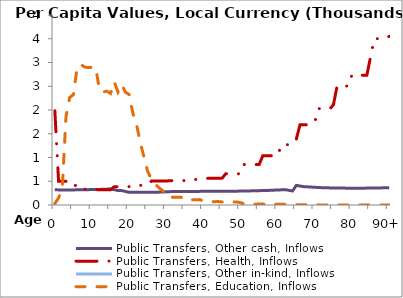
| Category | Public Transfers, Other cash, Inflows | Public Transfers, Health, Inflows | Public Transfers, Other in-kind, Inflows | Public Transfers, Education, Inflows |
|---|---|---|---|---|
| 0 | 319.309 | 1983.373 |  | 32.135 |
|  | 318.33 | 498.661 |  | 150.104 |
| 2 | 317.352 | 498.634 |  | 361.746 |
| 3 | 316.642 | 498.577 |  | 1859.614 |
| 4 | 316.993 | 498.581 |  | 2264.527 |
| 5 | 317.869 | 498.595 |  | 2323.455 |
| 6 | 319.094 | 333.888 |  | 2901.037 |
| 7 | 320.497 | 333.89 |  | 2957.593 |
| 8 | 321.9 | 333.895 |  | 2905.583 |
| 9 | 323.303 | 333.887 |  | 2892.647 |
| 10 | 324.706 | 333.883 |  | 2900.059 |
| 11 | 326.285 | 321.68 |  | 2891.752 |
| 12 | 328.214 | 321.669 |  | 2430.068 |
| 13 | 330.846 | 321.664 |  | 2377.22 |
| 14 | 333.826 | 321.657 |  | 2397.726 |
| 15 | 337.509 | 321.644 |  | 2347.552 |
| 16 | 321.728 | 386.093 |  | 2590.651 |
| 17 | 305.429 | 386.094 |  | 2378.329 |
| 18 | 303.396 | 386.094 |  | 2534.379 |
| 19 | 285.609 | 386.104 |  | 2375.406 |
| 20 | 266.884 | 386.108 |  | 2326.464 |
| 21 | 267.032 | 414.923 |  | 1929.193 |
| 22 | 267.352 | 414.96 |  | 1692.531 |
| 23 | 267.528 | 414.996 |  | 1311.458 |
| 24 | 267.705 | 415.042 |  | 1009.749 |
| 25 | 267.881 | 415.077 |  | 702.067 |
| 26 | 267.878 | 503.65 |  | 548.62 |
| 27 | 267.701 | 503.754 |  | 442.269 |
| 28 | 271.072 | 503.879 |  | 365.385 |
| 29 | 274.441 | 503.997 |  | 307.248 |
| 30 | 277.804 | 504.258 |  | 175.202 |
| 31 | 281.346 | 512.308 |  | 162.606 |
| 32 | 284.898 | 512.589 |  | 163.03 |
| 33 | 284.898 | 512.892 |  | 162.85 |
| 34 | 284.898 | 513.11 |  | 162.935 |
| 35 | 284.898 | 513.341 |  | 106.596 |
| 36 | 284.898 | 537.915 |  | 108.134 |
| 37 | 284.898 | 538.043 |  | 109.612 |
| 38 | 285.834 | 538.15 |  | 111.467 |
| 39 | 286.77 | 538.286 |  | 113.511 |
| 40 | 287.534 | 538.397 |  | 87.446 |
| 41 | 288.297 | 561.878 |  | 69.039 |
| 42 | 289.051 | 561.895 |  | 69.652 |
| 43 | 288.876 | 561.925 |  | 70.686 |
| 44 | 288.701 | 561.946 |  | 71.688 |
| 45 | 288.701 | 561.94 |  | 64.921 |
| 46 | 288.701 | 656.689 |  | 65.219 |
| 47 | 288.701 | 656.688 |  | 65.392 |
| 48 | 290.142 | 656.701 |  | 64.943 |
| 49 | 291.57 | 656.74 |  | 63.622 |
| 50 | 293.004 | 656.789 |  | 49.489 |
| 51 | 294.439 | 852.338 |  | 18.427 |
| 52 | 295.877 | 852.301 |  | 17.02 |
| 53 | 297.864 | 852.268 |  | 15.632 |
| 54 | 299.882 | 852.243 |  | 14.463 |
| 55 | 301.904 | 852.219 |  | 20.965 |
| 56 | 303.917 | 1039.327 |  | 20.165 |
| 57 | 305.747 | 1039.223 |  | 19.077 |
| 58 | 309.126 | 1039.033 |  | 18.203 |
| 59 | 312.532 | 1038.736 |  | 17.602 |
| 60 | 315.863 | 1038.375 |  | 16.213 |
| 61 | 319.235 | 1270.85 |  | 14.04 |
| 62 | 323.053 | 1269.935 |  | 13.902 |
| 63 | 309.288 | 1269.419 |  | 13.587 |
| 64 | 295.654 | 1269.024 |  | 12.909 |
| 65 | 413.12 | 1382.911 |  | 3.75 |
| 66 | 399.727 | 1688.616 |  | 3.745 |
| 67 | 386.472 | 1687.864 |  | 3.784 |
| 68 | 381.986 | 1686.755 |  | 3.834 |
| 69 | 377.255 | 1685.537 |  | 3.926 |
| 70 | 372.725 | 1755.301 |  | 4.066 |
| 71 | 368.238 | 2028.924 |  | 0 |
| 72 | 363.806 | 2026.654 |  | 0 |
| 73 | 362.152 | 2024.321 |  | 0 |
| 74 | 360.495 | 2021.883 |  | 0 |
| 75 | 358.834 | 2109.504 |  | 0 |
| 76 | 357.386 | 2512.612 |  | 0 |
| 77 | 356.019 | 2509.69 |  | 0 |
| 78 | 355.334 | 2506.288 |  | 0 |
| 79 | 354.823 | 2502.261 |  | 0 |
| 80 | 354.324 | 2745.311 |  | 0 |
| 81 | 353.658 | 2735.465 |  | 0 |
| 82 | 353.018 | 2733.185 |  | 0 |
| 83 | 354.286 | 2731.377 |  | 0 |
| 84 | 355.531 | 2729.82 |  | 0 |
| 85 | 356.565 | 3120.936 |  | 0 |
| 86 | 357.777 | 3501.333 |  | 0 |
| 87 | 358.969 | 3502.107 |  | 0 |
| 88 | 360.484 | 3502.85 |  | 0 |
| 89 | 361.906 | 3503.58 |  | 0 |
| 90+ | 363.328 | 3549.921 |  | 0 |